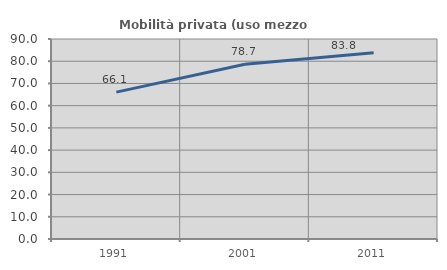
| Category | Mobilità privata (uso mezzo privato) |
|---|---|
| 1991.0 | 66.08 |
| 2001.0 | 78.661 |
| 2011.0 | 83.796 |